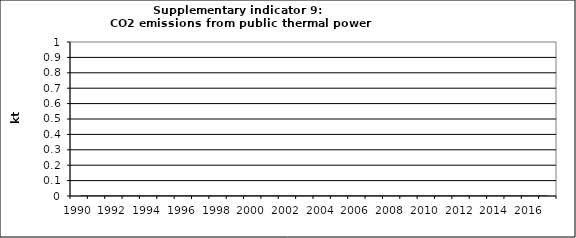
| Category | CO2 emissions from public thermal power stations, kt |
|---|---|
| 1990 | 0 |
| 1991 | 0 |
| 1992 | 0 |
| 1993 | 0 |
| 1994 | 0 |
| 1995 | 0 |
| 1996 | 0 |
| 1997 | 0 |
| 1998 | 0 |
| 1999 | 0 |
| 2000 | 0 |
| 2001 | 0 |
| 2002 | 0 |
| 2003 | 0 |
| 2004 | 0 |
| 2005 | 0 |
| 2006 | 0 |
| 2007 | 0 |
| 2008 | 0 |
| 2009 | 0 |
| 2010 | 0 |
| 2011 | 0 |
| 2012 | 0 |
| 2013 | 0 |
| 2014 | 0 |
| 2015 | 0 |
| 2016 | 0 |
| 2017 | 0 |